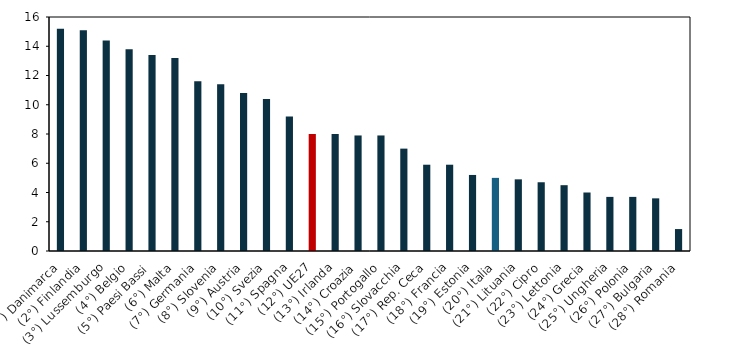
| Category | 2023 |
|---|---|
| (1°) Danimarca | 15.2 |
| (2°) Finlandia | 15.1 |
| (3°) Lussemburgo | 14.4 |
| (4°) Belgio | 13.8 |
| (5°) Paesi Bassi | 13.4 |
| (6°) Malta | 13.2 |
| (7°) Germania | 11.6 |
| (8°) Slovenia | 11.4 |
| (9°) Austria | 10.8 |
| (10°) Svezia | 10.4 |
| (11°) Spagna | 9.2 |
| (12°) UE27 | 8 |
| (13°) Irlanda | 8 |
| (14°) Croazia | 7.9 |
| (15°) Portogallo | 7.9 |
| (16°) Slovacchia | 7 |
| (17°) Rep. Ceca | 5.9 |
| (18°) Francia | 5.9 |
| (19°) Estonia | 5.2 |
| (20°) Italia | 5 |
| (21°) Lituania | 4.9 |
| (22°) Cipro | 4.7 |
| (23°) Lettonia | 4.5 |
| (24°) Grecia | 4 |
| (25°) Ungheria | 3.7 |
| (26°) Polonia | 3.7 |
| (27°) Bulgaria | 3.6 |
| (28°) Romania | 1.5 |